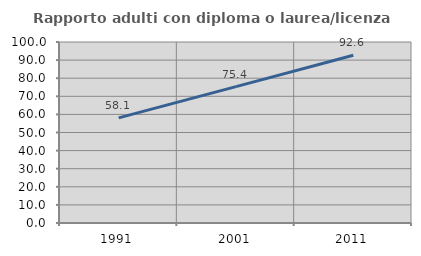
| Category | Rapporto adulti con diploma o laurea/licenza media  |
|---|---|
| 1991.0 | 58.065 |
| 2001.0 | 75.362 |
| 2011.0 | 92.647 |